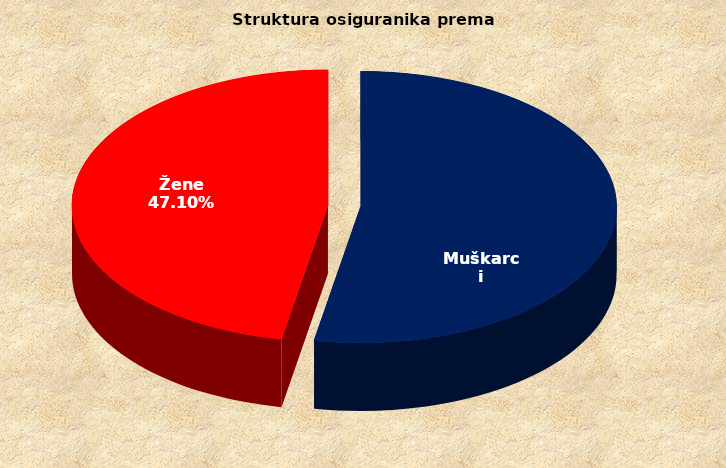
| Category | Series 0 |
|---|---|
| Muškarci | 850504 |
| Žene | 757230 |